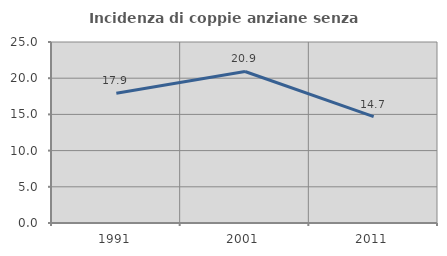
| Category | Incidenza di coppie anziane senza figli  |
|---|---|
| 1991.0 | 17.917 |
| 2001.0 | 20.93 |
| 2011.0 | 14.692 |